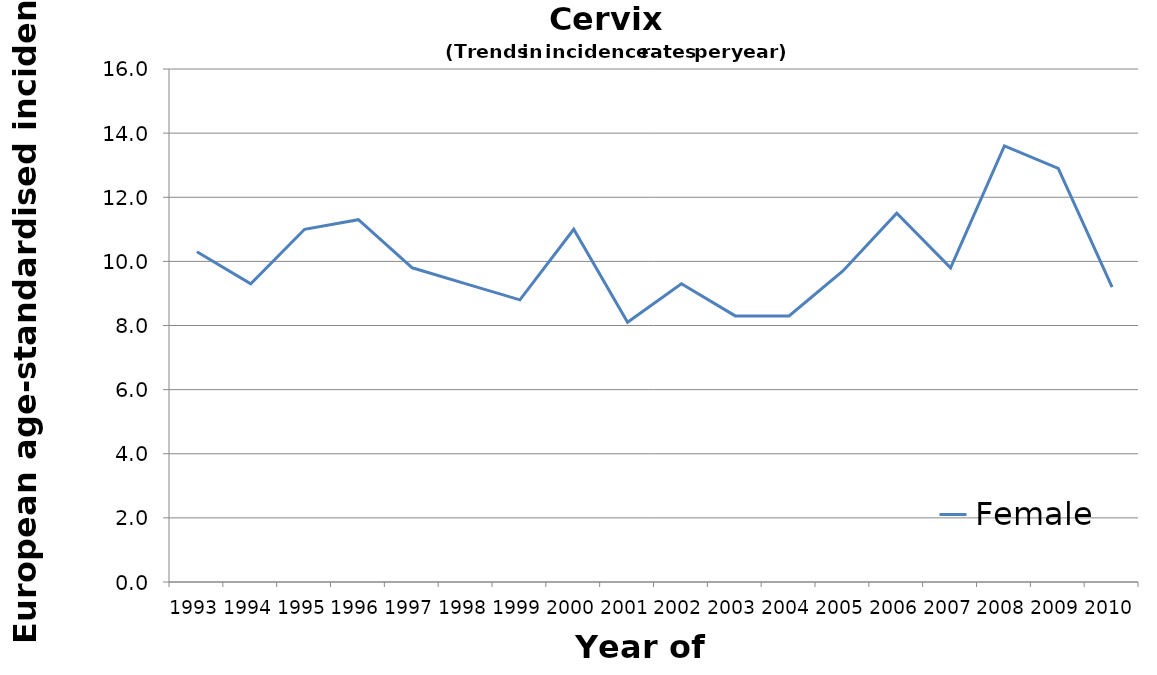
| Category | Female |
|---|---|
| 1993.0 | 10.3 |
| 1994.0 | 9.3 |
| 1995.0 | 11 |
| 1996.0 | 11.3 |
| 1997.0 | 9.8 |
| 1998.0 | 9.3 |
| 1999.0 | 8.8 |
| 2000.0 | 11 |
| 2001.0 | 8.1 |
| 2002.0 | 9.3 |
| 2003.0 | 8.3 |
| 2004.0 | 8.3 |
| 2005.0 | 9.7 |
| 2006.0 | 11.5 |
| 2007.0 | 9.8 |
| 2008.0 | 13.6 |
| 2009.0 | 12.9 |
| 2010.0 | 9.2 |